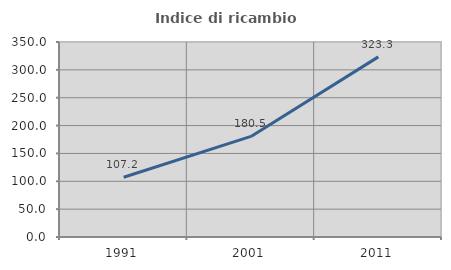
| Category | Indice di ricambio occupazionale  |
|---|---|
| 1991.0 | 107.219 |
| 2001.0 | 180.5 |
| 2011.0 | 323.276 |